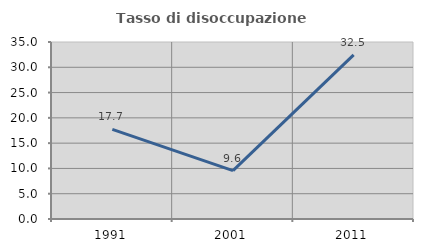
| Category | Tasso di disoccupazione giovanile  |
|---|---|
| 1991.0 | 17.734 |
| 2001.0 | 9.565 |
| 2011.0 | 32.468 |